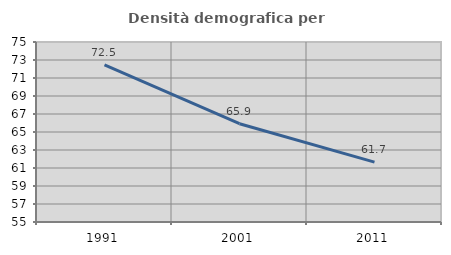
| Category | Densità demografica |
|---|---|
| 1991.0 | 72.471 |
| 2001.0 | 65.92 |
| 2011.0 | 61.657 |